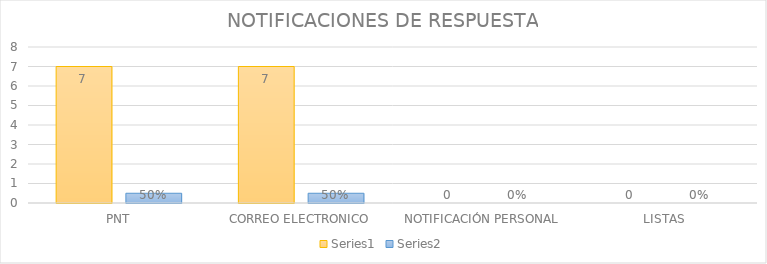
| Category | Series 3 | Series 4 |
|---|---|---|
| PNT | 7 | 0.5 |
| CORREO ELECTRONICO | 7 | 0.5 |
| NOTIFICACIÓN PERSONAL | 0 | 0 |
| LISTAS | 0 | 0 |